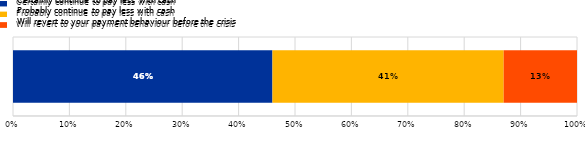
| Category | Certainly continue to pay less with cash | Probably continue to pay less with cash | Will revert to your payment behaviour before the crisis |
|---|---|---|---|
| 0 | 0.46 | 0.41 | 0.13 |